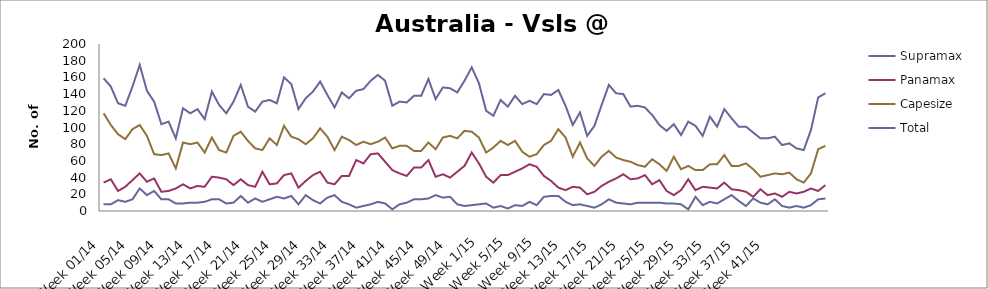
| Category | Supramax | Panamax | Capesize | Total |
|---|---|---|---|---|
| Week 01/14 | 8 | 34 | 117 | 159 |
| Week 02/14 | 8 | 38 | 103 | 149 |
| Week 03/14 | 13 | 24 | 92 | 129 |
| Week 04/14 | 11 | 29 | 86 | 126 |
| Week 05/14 | 14 | 37 | 98 | 149 |
| Week 06/14 | 27 | 45 | 103 | 175 |
| Week 07/14 | 19 | 35 | 90 | 144 |
| Week 08/14 | 24 | 39 | 68 | 131 |
| Week 09/14 | 14 | 23 | 67 | 104 |
| Week 10/14 | 14 | 24 | 69 | 107 |
| Week 11/14 | 9 | 27 | 51 | 87 |
| Week 12/14 | 9 | 32 | 82 | 123 |
| Week 13/14 | 10 | 27 | 80 | 117 |
| Week 14/14 | 10 | 30 | 82 | 122 |
| Week 15/14 | 11 | 29 | 70 | 110 |
| Week 16/14 | 14 | 41 | 88 | 143 |
| Week 17/14 | 14 | 40 | 73 | 127 |
| Week 18/14 | 9 | 38 | 70 | 117 |
| Week 19/14 | 10 | 31 | 90 | 131 |
| Week 20/14 | 18 | 38 | 95 | 151 |
| Week 21/14 | 10 | 31 | 84 | 125 |
| Week 22/14 | 15 | 29 | 75 | 119 |
| Week 23/14 | 11 | 47 | 73 | 131 |
| Week 24/14 | 14 | 32 | 87 | 133 |
| Week 25/14 | 17 | 33 | 79 | 129 |
| Week 26/14 | 15 | 43 | 102 | 160 |
| Week 27/14 | 18 | 45 | 89 | 152 |
| Week 28/14 | 8 | 28 | 86 | 122 |
| Week 29/14 | 19 | 36 | 80 | 135 |
| Week 30/14 | 13 | 43 | 87 | 143 |
| Week 31/14 | 9 | 47 | 99 | 155 |
| Week 32/14 | 16 | 34 | 89 | 139 |
| Week 33/14 | 19 | 32 | 73 | 124 |
| Week 34/14 | 11 | 42 | 89 | 142 |
| Week 35/14 | 8 | 42 | 85 | 135 |
| Week 36/14 | 4 | 61 | 79 | 144 |
| Week 37/14 | 6 | 57 | 83 | 146 |
| Week 38/14 | 8 | 68 | 80 | 156 |
| Week 39/14 | 11 | 69 | 83 | 163 |
| Week 40/14 | 9 | 59 | 88 | 156 |
| Week 41/14 | 2 | 49 | 75 | 126 |
| Week 42/14 | 8 | 45 | 78 | 131 |
| Week 43/14 | 10 | 42 | 78 | 130 |
| Week 44/14 | 14 | 52 | 72 | 138 |
| Week 45/14 | 14 | 52 | 72 | 138 |
| Week 46/14 | 15 | 61 | 82 | 158 |
| Week 47/14 | 19 | 41 | 74 | 134 |
| Week 48/14 | 16 | 44 | 88 | 148 |
| Week 49/14 | 17 | 40 | 90 | 147 |
| Week 50/14 | 8 | 47 | 87 | 142 |
| Week 51/14 | 6 | 54 | 96 | 156 |
| Week 52/14 | 7 | 70 | 95 | 172 |
| Week 1/15 | 8 | 57 | 88 | 153 |
| Week 2/15 | 9 | 41 | 70 | 120 |
| Week 3/15 | 4 | 34 | 76 | 114 |
| Week 4/15 | 6 | 43 | 84 | 133 |
| Week 5/15 | 3 | 43 | 79 | 125 |
| Week 6/15 | 7 | 47 | 84 | 138 |
| Week 7/15 | 6 | 51 | 71 | 128 |
| Week 8/15 | 11 | 56 | 65 | 132 |
| Week 9/15 | 7 | 53 | 68 | 128 |
| Week 10/15 | 17 | 42 | 79 | 140 |
| Week 11/15 | 18 | 36 | 84 | 139 |
| Week 12/15 | 18 | 28 | 98 | 145 |
| Week 13/15 | 11 | 25 | 88 | 126 |
| Week 14/15 | 7 | 29 | 65 | 103 |
| Week 15/15 | 8 | 28 | 82 | 118 |
| Week 16/15 | 6 | 20 | 63 | 90 |
| Week 17/15 | 4 | 23 | 54 | 102 |
| Week 18/15 | 8 | 30 | 65 | 127 |
| Week 19/15 | 14 | 35 | 72 | 151 |
| Week 20/15 | 10 | 39 | 64 | 141 |
| Week 21/15 | 9 | 44 | 61 | 140 |
| Week 22/15 | 8 | 38 | 59 | 125 |
| Week 23/15 | 10 | 39 | 55 | 126 |
| Week 24/15 | 10 | 43 | 53 | 124 |
| Week 25/15 | 10 | 32 | 62 | 115 |
| Week 26/15 | 10 | 37 | 56 | 103 |
| Week 27/15 | 9 | 24 | 48 | 96 |
| Week 28/15 | 9 | 19 | 65 | 104 |
| Week 29/15 | 8 | 25 | 50 | 91 |
| Week 30/15 | 2 | 38 | 54 | 107 |
| Week 31/15 | 17 | 25 | 49 | 102 |
| Week 32/15 | 7 | 29 | 49 | 90 |
| Week 33/15 | 11 | 28 | 56 | 113 |
| Week 34/15 | 9 | 27 | 56 | 101 |
| Week 35/15 | 14 | 34 | 67 | 122 |
| Week 36/15 | 19 | 26 | 54 | 111 |
| Week 37/15 | 12 | 25 | 54 | 101 |
| Week 38/15 | 6 | 23 | 57 | 101 |
| Week 39/15 | 15 | 17 | 50 | 94 |
| Week 40/15 | 10 | 26 | 41 | 87 |
| Week 41/15 | 8 | 19 | 43 | 87 |
| Week 42/15 | 14 | 21 | 45 | 89 |